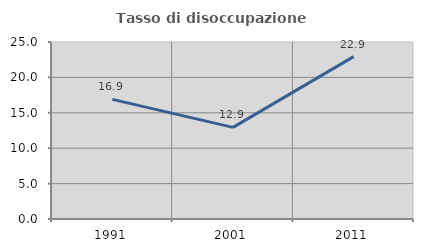
| Category | Tasso di disoccupazione giovanile  |
|---|---|
| 1991.0 | 16.901 |
| 2001.0 | 12.942 |
| 2011.0 | 22.93 |